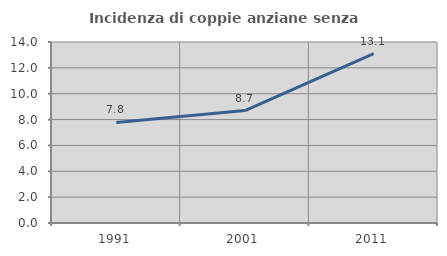
| Category | Incidenza di coppie anziane senza figli  |
|---|---|
| 1991.0 | 7.777 |
| 2001.0 | 8.701 |
| 2011.0 | 13.108 |